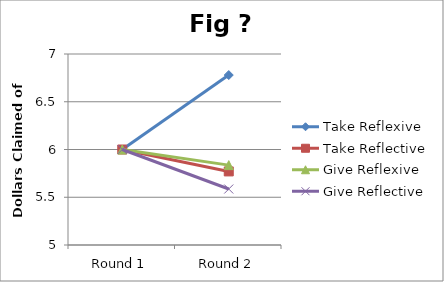
| Category | Take Reflexive | Take Reflective | Give Reflexive | Give Reflective |
|---|---|---|---|---|
| Round 1 | 6 | 6 | 6 | 6 |
| Round 2 | 6.78 | 5.77 | 5.836 | 5.586 |